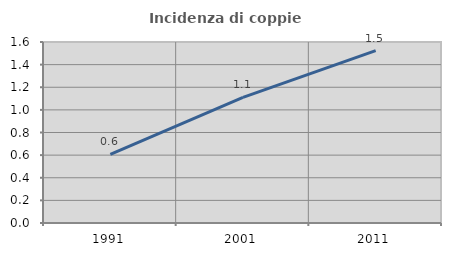
| Category | Incidenza di coppie miste |
|---|---|
| 1991.0 | 0.607 |
| 2001.0 | 1.111 |
| 2011.0 | 1.524 |